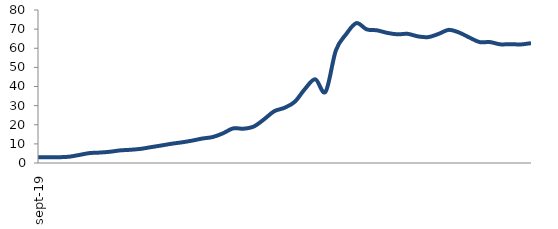
| Category | Series 0 |
|---|---|
| 2019-09-01 | 3.068 |
| 2019-10-01 | 3.068 |
| 2019-11-01 | 3.019 |
| 2019-12-01 | 3.273 |
| 2020-01-01 | 4.186 |
| 2020-02-01 | 5.17 |
| 2020-03-01 | 5.444 |
| 2020-04-01 | 5.874 |
| 2020-05-01 | 6.591 |
| 2020-06-01 | 6.913 |
| 2020-07-01 | 7.395 |
| 2020-08-01 | 8.292 |
| 2020-09-01 | 9.145 |
| 2020-10-01 | 10.067 |
| 2020-11-01 | 10.794 |
| 2020-12-01 | 11.695 |
| 2021-01-01 | 12.796 |
| 2021-02-01 | 13.569 |
| 2021-03-01 | 15.494 |
| 2021-04-01 | 18.102 |
| 2021-05-01 | 17.933 |
| 2021-06-01 | 19.058 |
| 2021-07-01 | 22.799 |
| 2021-08-01 | 27.071 |
| 2021-09-01 | 28.872 |
| 2021-10-01 | 32.01 |
| 2021-11-01 | 38.771 |
| 2021-12-01 | 43.773 |
| 2022-01-01 | 37.28 |
| 2022-02-01 | 58.857 |
| 2022-03-01 | 67.349 |
| 2022-04-01 | 73.13 |
| 2022-05-01 | 69.874 |
| 2022-06-01 | 69.376 |
| 2022-07-01 | 68.04 |
| 2022-08-01 | 67.278 |
| 2022-09-01 | 67.518 |
| 2022-10-01 | 66.201 |
| 2022-11-01 | 65.824 |
| 2022-12-01 | 67.5 |
| 2023-01-01 | 69.621 |
| 2023-02-01 | 68.213 |
| 2023-03-01 | 65.618 |
| 2023-04-01 | 63.206 |
| 2023-05-01 | 63.235 |
| 2023-06-01 | 62.047 |
| 2023-07-01 | 62.154 |
| 2023-08-01 | 61.989 |
| 2023-09-01 | 62.663 |